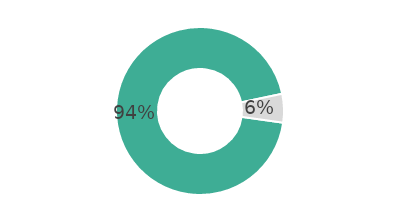
| Category | Series 0 |
|---|---|
| 0 | 94.492 |
| 1 | 5.508 |